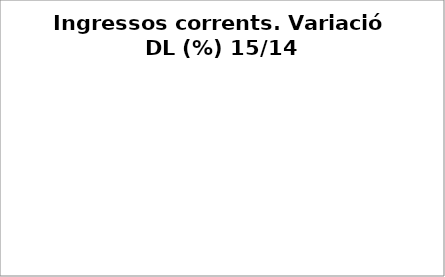
| Category | Series 0 |
|---|---|
| Impostos locals | 0.057 |
| Participació Tributs de l'Estat | 0.065 |
| Taxes i altres ingressos | -0.017 |
| Transferències corrents (exc. FCF) | 0.009 |
| Ingressos patrimonials | 0.211 |
| Ingressos corrents | 0.053 |